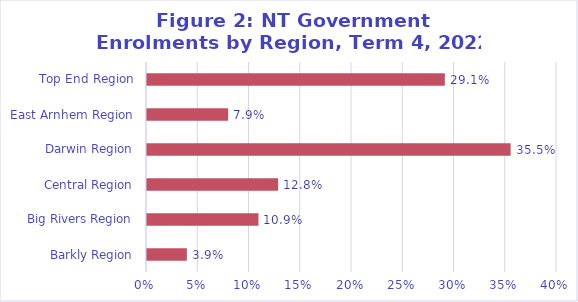
| Category | Series 0 |
|---|---|
| Barkly Region | 0.039 |
| Big Rivers Region | 0.109 |
| Central Region | 0.128 |
| Darwin Region | 0.355 |
| East Arnhem Region | 0.079 |
| Top End Region | 0.291 |